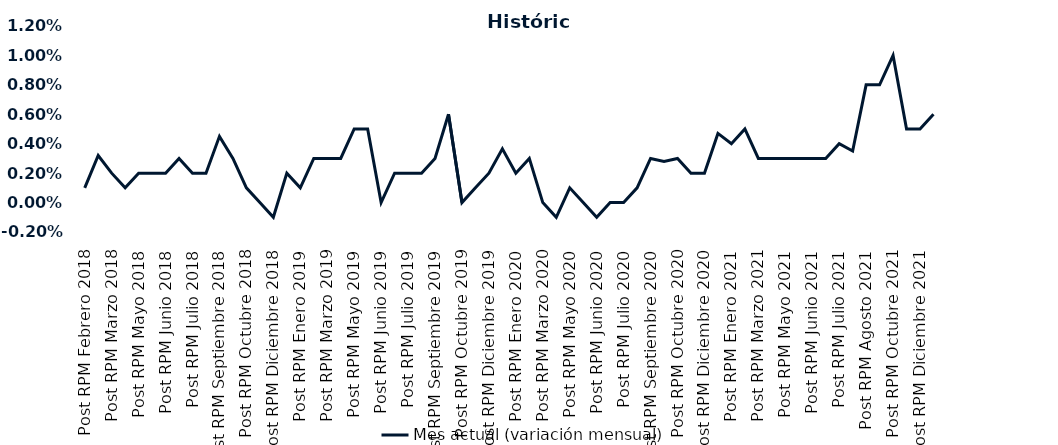
| Category | Mes actual (variación mensual)  |
|---|---|
| Post RPM Febrero 2018 | 0.001 |
| Pre RPM Marzo 2018 | 0.003 |
| Post RPM Marzo 2018 | 0.002 |
| Pre RPM Mayo 2018 | 0.001 |
| Post RPM Mayo 2018 | 0.002 |
| Pre RPM Junio 2018 | 0.002 |
| Post RPM Junio 2018 | 0.002 |
| Pre RPM Julio 2018 | 0.003 |
| Post RPM Julio 2018 | 0.002 |
| Pre RPM Septiembre 2018 | 0.002 |
| Post RPM Septiembre 2018 | 0.004 |
| Pre RPM Octubre 2018 | 0.003 |
| Post RPM Octubre 2018 | 0.001 |
| Pre RPM Diciembre 2018 | 0 |
| Post RPM Diciembre 2018 | -0.001 |
| Pre RPM Enero 2019 | 0.002 |
| Post RPM Enero 2019 | 0.001 |
| Pre RPM Marzo 2019 | 0.003 |
| Post RPM Marzo 2019 | 0.003 |
| Pre RPM Mayo 2019 | 0.003 |
| Post RPM Mayo 2019 | 0.005 |
| Pre RPM Junio 2019 | 0.005 |
| Post RPM Junio 2019 | 0 |
| Pre RPM Julio 2019 | 0.002 |
| Post RPM Julio 2019 | 0.002 |
| Pre RPM Septiembre 2019 | 0.002 |
| Post RPM Septiembre 2019 | 0.003 |
| Pre RPM Octubre 2019 | 0.006 |
| Post RPM Octubre 2019 | 0 |
| Pre RPM Diciembre 2019 | 0.001 |
| Post RPM Diciembre 2019 | 0.002 |
| Pre RPM Enero 2020 | 0.004 |
| Post RPM Enero 2020 | 0.002 |
| Pre RPM Marzo 2020 | 0.003 |
| Post RPM Marzo 2020 | 0 |
| Pre RPM Mayo 2020 | -0.001 |
| Post RPM Mayo 2020 | 0.001 |
| Pre RPM Junio 2020 | 0 |
| Post RPM Junio 2020 | -0.001 |
| Pre RPM Julio 2020 | 0 |
| Post RPM Julio 2020 | 0 |
| Pre RPM Septiembre 2020 | 0.001 |
| Post RPM Septiembre 2020 | 0.003 |
| Pre RPM Octubre 2020 | 0.003 |
| Post RPM Octubre 2020 | 0.003 |
| Pre RPM Diciembre 2020 | 0.002 |
| Post RPM Diciembre 2020 | 0.002 |
| Pre RPM Enero 2021 | 0.005 |
| Post RPM Enero 2021 | 0.004 |
| Pre RPM Marzo 2021 | 0.005 |
| Post RPM Marzo 2021 | 0.003 |
| Pre RPM Mayo 2021 | 0.003 |
| Post RPM Mayo 2021 | 0.003 |
| Pre RPM Junio 2021 | 0.003 |
| Post RPM Junio 2021 | 0.003 |
| Pre RPM Julio 2021 | 0.003 |
| Post RPM Julio 2021 | 0.004 |
| Pre RPM Agosto 2021 | 0.004 |
| Post RPM Agosto 2021 | 0.008 |
| Pre RPM Octubre 2021 | 0.008 |
| Post RPM Octubre 2021 | 0.01 |
| Pre RPM Diciembre 2021 | 0.005 |
| Post RPM Diciembre 2021 | 0.005 |
| Pre RPM Enero 2022 | 0.006 |